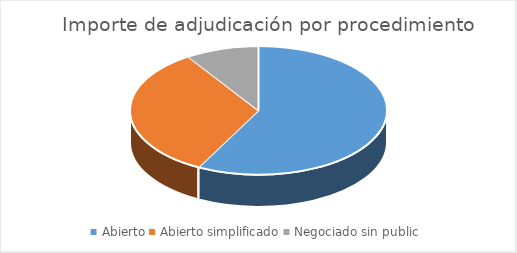
| Category | Series 0 |
|---|---|
| Abierto | 3656643.93 |
| Abierto simplificado | 2092562.37 |
| Negociado sin public | 585580.67 |